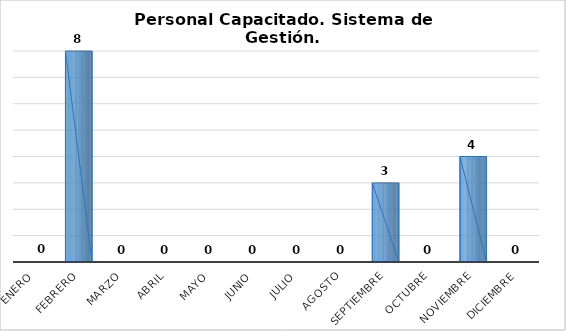
| Category | Personal capacitado/2 |
|---|---|
| Enero | 0 |
| Febrero | 8 |
| Marzo | 0 |
| Abril | 0 |
| Mayo | 0 |
| Junio | 0 |
| Julio | 0 |
| Agosto | 0 |
| Septiembre | 3 |
| Octubre | 0 |
| Noviembre | 4 |
| Diciembre | 0 |